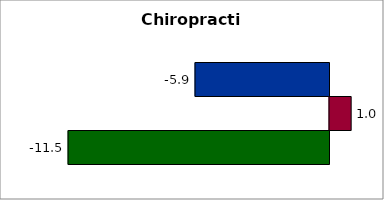
| Category | 50 states and D.C. | SREB states | State |
|---|---|---|---|
| 0 | -5.889 | 0.952 | -11.47 |